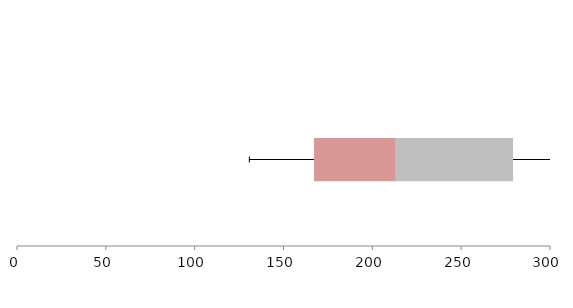
| Category | Series 1 | Series 2 | Series 3 |
|---|---|---|---|
| 0 | 167.2 | 46.033 | 65.96 |